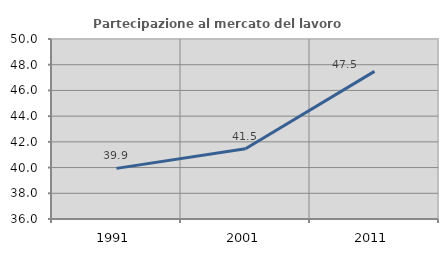
| Category | Partecipazione al mercato del lavoro  femminile |
|---|---|
| 1991.0 | 39.938 |
| 2001.0 | 41.467 |
| 2011.0 | 47.481 |